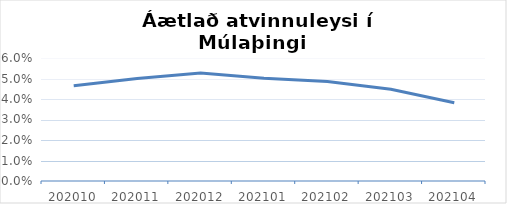
| Category | Áætlað atvinnuleysi |
|---|---|
| 202010.0 | 0.046 |
| 202011.0 | 0.05 |
| 202012.0 | 0.053 |
| 202101.0 | 0.05 |
| 202102.0 | 0.049 |
| 202103.0 | 0.045 |
| 202104.0 | 0.038 |